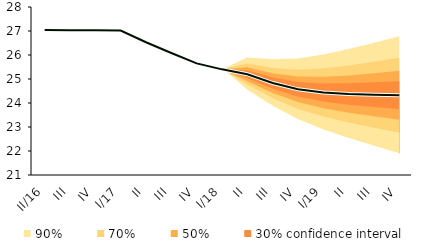
| Category | linka | Centerline |
|---|---|---|
| 0 | 27.039 | 27.039 |
| 1 | 27.028 | 27.028 |
| 2 | 27.028 | 27.028 |
| 3 | 27.02 | 27.02 |
| 4 | 26.532 | 26.532 |
| 5 | 26.084 | 26.084 |
| 6 | 25.651 | 25.651 |
| 7 | 25.402 | 25.402 |
| 8 | 25.2 | 25.2 |
| 9 | 24.832 | 24.832 |
| 10 | 24.57 | 24.57 |
| 11 | 24.437 | 24.437 |
| 12 | 24.375 | 24.375 |
| 13 | 24.345 | 24.345 |
| 14 | 24.321 | 24.321 |